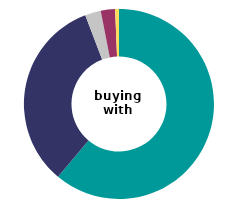
| Category | buying with mortgage |
|---|---|
| very 
satisfied | 61.097 |
| fairly
satisfied | 33.128 |
| neither satisfied 
nor dissatisfied | 2.681 |
| slightly 
dissatisfied | 2.44 |
| very
 dissatisfied | 0.654 |